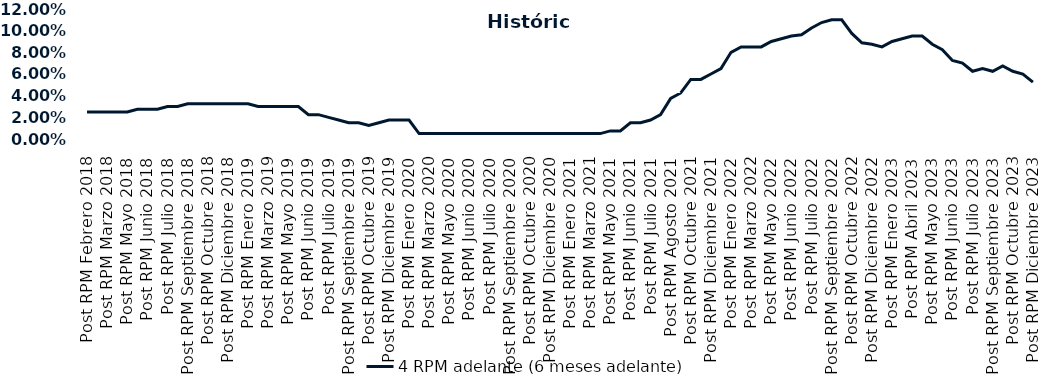
| Category | 4 RPM adelante (6 meses adelante) |
|---|---|
| Post RPM Febrero 2018 | 0.025 |
| Pre RPM Marzo 2018 | 0.025 |
| Post RPM Marzo 2018 | 0.025 |
| Pre RPM Mayo 2018 | 0.025 |
| Post RPM Mayo 2018 | 0.025 |
| Pre RPM Junio 2018 | 0.028 |
| Post RPM Junio 2018 | 0.028 |
| Pre RPM Julio 2018 | 0.028 |
| Post RPM Julio 2018 | 0.03 |
| Pre RPM Septiembre 2018 | 0.03 |
| Post RPM Septiembre 2018 | 0.032 |
| Pre RPM Octubre 2018 | 0.032 |
| Post RPM Octubre 2018 | 0.032 |
| Pre RPM Diciembre 2018 | 0.032 |
| Post RPM Diciembre 2018 | 0.032 |
| Pre RPM Enero 2019 | 0.032 |
| Post RPM Enero 2019 | 0.032 |
| Pre RPM Marzo 2019 | 0.03 |
| Post RPM Marzo 2019 | 0.03 |
| Pre RPM Mayo 2019 | 0.03 |
| Post RPM Mayo 2019 | 0.03 |
| Pre RPM Junio 2019 | 0.03 |
| Post RPM Junio 2019 | 0.022 |
| Pre RPM Julio 2019 | 0.022 |
| Post RPM Julio 2019 | 0.02 |
| Pre RPM Septiembre 2019 | 0.018 |
| Post RPM Septiembre 2019 | 0.015 |
| Pre RPM Octubre 2019 | 0.015 |
| Post RPM Octubre 2019 | 0.012 |
| Pre RPM Diciembre 2019 | 0.015 |
| Post RPM Diciembre 2019 | 0.018 |
| Pre RPM Enero 2020 | 0.018 |
| Post RPM Enero 2020 | 0.018 |
| Pre RPM Marzo 2020 | 0.005 |
| Post RPM Marzo 2020 | 0.005 |
| Pre RPM Mayo 2020 | 0.005 |
| Post RPM Mayo 2020 | 0.005 |
| Pre RPM Junio 2020 | 0.005 |
| Post RPM Junio 2020 | 0.005 |
| Pre RPM Julio 2020 | 0.005 |
| Post RPM Julio 2020 | 0.005 |
| Pre RPM Septiembre 2020 | 0.005 |
| Post RPM Septiembre 2020 | 0.005 |
| Pre RPM Octubre 2020 | 0.005 |
| Post RPM Octubre 2020 | 0.005 |
| Pre RPM Diciembre 2020 | 0.005 |
| Post RPM Diciembre 2020 | 0.005 |
| Pre RPM Enero 2021 | 0.005 |
| Post RPM Enero 2021 | 0.005 |
| Pre RPM Marzo 2021 | 0.005 |
| Post RPM Marzo 2021 | 0.005 |
| Pre RPM Mayo 2021 | 0.005 |
| Post RPM Mayo 2021 | 0.008 |
| Pre RPM Junio 2021 | 0.008 |
| Post RPM Junio 2021 | 0.015 |
| Pre RPM Julio 2021 | 0.015 |
| Post RPM Julio 2021 | 0.018 |
| Pre RPM Agosto 2021 | 0.022 |
| Post RPM Agosto 2021 | 0.038 |
| Pre RPM Octubre 2021 | 0.042 |
| Post RPM Octubre 2021 | 0.055 |
| Pre RPM Diciembre 2021 | 0.055 |
| Post RPM Diciembre 2021 | 0.06 |
| Pre RPM Enero 2022 | 0.065 |
| Post RPM Enero 2022 | 0.08 |
| Pre RPM Marzo 2022 | 0.085 |
| Post RPM Marzo 2022 | 0.085 |
| Pre RPM Mayo 2022 | 0.085 |
| Post RPM Mayo 2022 | 0.09 |
| Pre RPM Junio 2022 | 0.092 |
| Post RPM Junio 2022 | 0.095 |
| Pre RPM Julio 2022 | 0.096 |
| Post RPM Julio 2022 | 0.102 |
| Pre RPM Septiembre 2022 | 0.108 |
| Post RPM Septiembre 2022 | 0.11 |
| Pre RPM Octubre 2022 | 0.11 |
| Post RPM Octubre 2022 | 0.098 |
| Pre RPM Diciembre 2022 | 0.089 |
| Post RPM Diciembre 2022 | 0.088 |
| Pre RPM Enero 2023 | 0.085 |
| Post RPM Enero 2023 | 0.09 |
| Pre RPM Abril 2023 | 0.092 |
| Post RPM Abril 2023 | 0.095 |
| Pre RPM Mayo 2023 | 0.095 |
| Post RPM Mayo 2023 | 0.088 |
| Pre RPM Junio 2023 | 0.082 |
| Post RPM Junio 2023 | 0.072 |
| Pre RPM Julio 2023 | 0.07 |
| Post RPM Julio 2023 | 0.062 |
| Pre RPM Septiembre 2023 | 0.065 |
| Post RPM Septiembre 2023 | 0.062 |
| Pre RPM Octubre 2023 | 0.068 |
| Post RPM Octubre 2023 | 0.062 |
| Pre RPM Diciembre 2023 | 0.06 |
| Post RPM Diciembre 2023 | 0.052 |